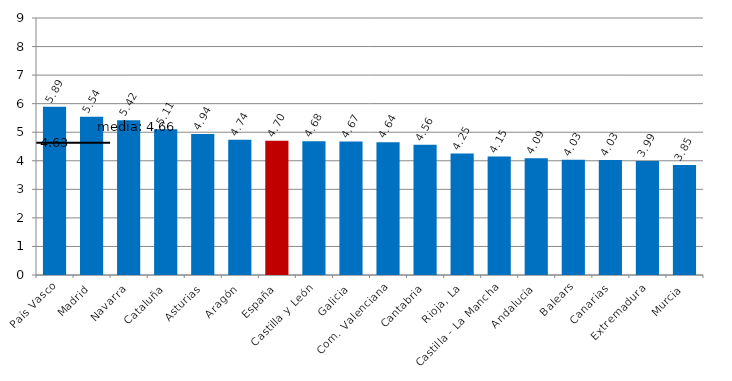
| Category | Series 0 |
|---|---|
| País Vasco | 5.891 |
| Madrid | 5.539 |
| Navarra | 5.422 |
| Cataluña | 5.105 |
| Asturias | 4.938 |
| Aragón | 4.738 |
| España | 4.699 |
| Castilla y León | 4.684 |
| Galicia | 4.672 |
| Com. Valenciana | 4.645 |
| Cantabria | 4.558 |
| Rioja, La | 4.254 |
| Castilla - La Mancha | 4.149 |
| Andalucía | 4.086 |
| Balears | 4.032 |
| Canarias | 4.03 |
| Extremadura | 3.992 |
| Murcia | 3.851 |